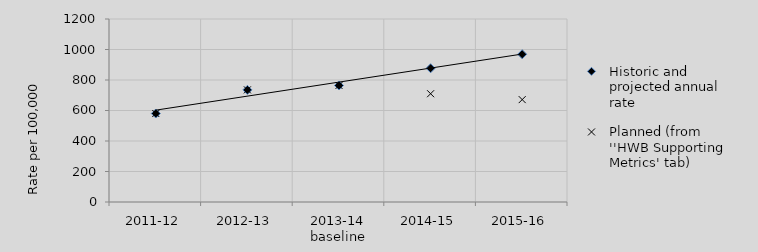
| Category | Historic and projected annual rate | Planned (from ''HWB Supporting Metrics' tab) |
|---|---|---|
| 2011-12 | 580.3 | 580.3 |
| 2012-13 | 735.3 | 735.3 |
| 2013-14 baseline | 764.2 | 764.2 |
| 2014-15 | 877.167 | 709.969 |
| 2015-16 | 969.117 | 671.374 |